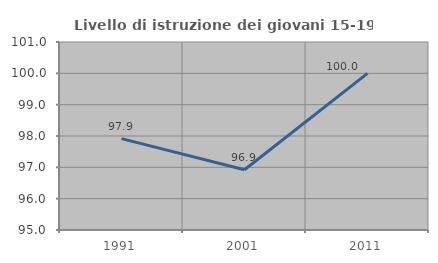
| Category | Livello di istruzione dei giovani 15-19 anni |
|---|---|
| 1991.0 | 97.917 |
| 2001.0 | 96.923 |
| 2011.0 | 100 |